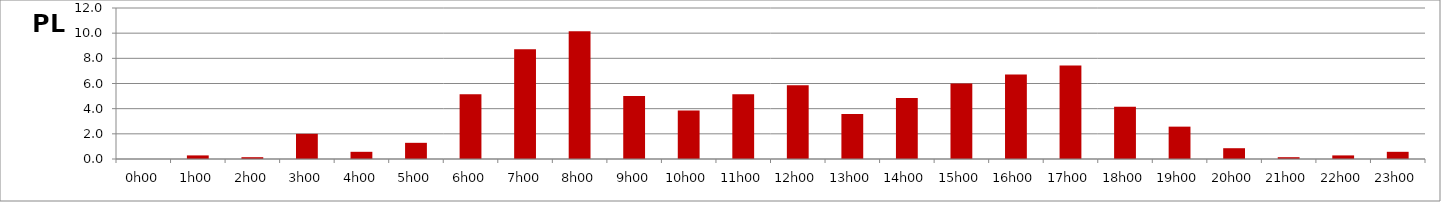
| Category | PL |
|---|---|
| 0.0 | 0 |
| 0.041666666666666664 | 0.286 |
| 0.08333333333333333 | 0.143 |
| 0.125 | 2 |
| 0.16666666666666666 | 0.571 |
| 0.20833333333333334 | 1.286 |
| 0.25 | 5.143 |
| 0.2916666666666667 | 8.714 |
| 0.3333333333333333 | 10.143 |
| 0.375 | 5 |
| 0.4166666666666667 | 3.857 |
| 0.4583333333333333 | 5.143 |
| 0.5 | 5.857 |
| 0.5416666666666666 | 3.571 |
| 0.5833333333333334 | 4.857 |
| 0.625 | 6 |
| 0.6666666666666666 | 6.714 |
| 0.7083333333333334 | 7.429 |
| 0.75 | 4.143 |
| 0.7916666666666666 | 2.571 |
| 0.8333333333333334 | 0.857 |
| 0.875 | 0.143 |
| 0.9166666666666666 | 0.286 |
| 0.9583333333333334 | 0.571 |